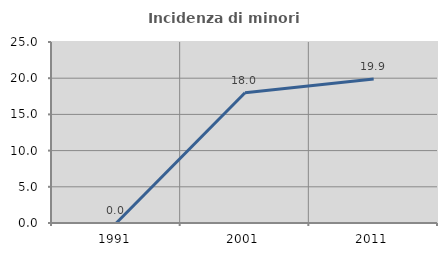
| Category | Incidenza di minori stranieri |
|---|---|
| 1991.0 | 0 |
| 2001.0 | 18 |
| 2011.0 | 19.88 |